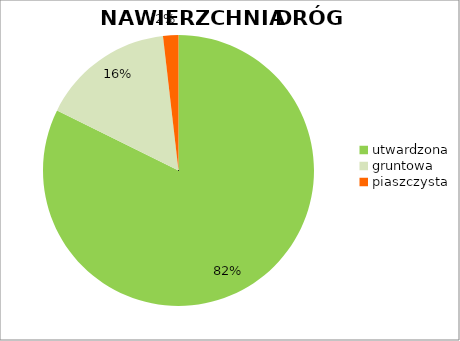
| Category | Series 0 |
|---|---|
| utwardzona | 0.823 |
| gruntowa | 0.159 |
| piaszczysta | 0.018 |